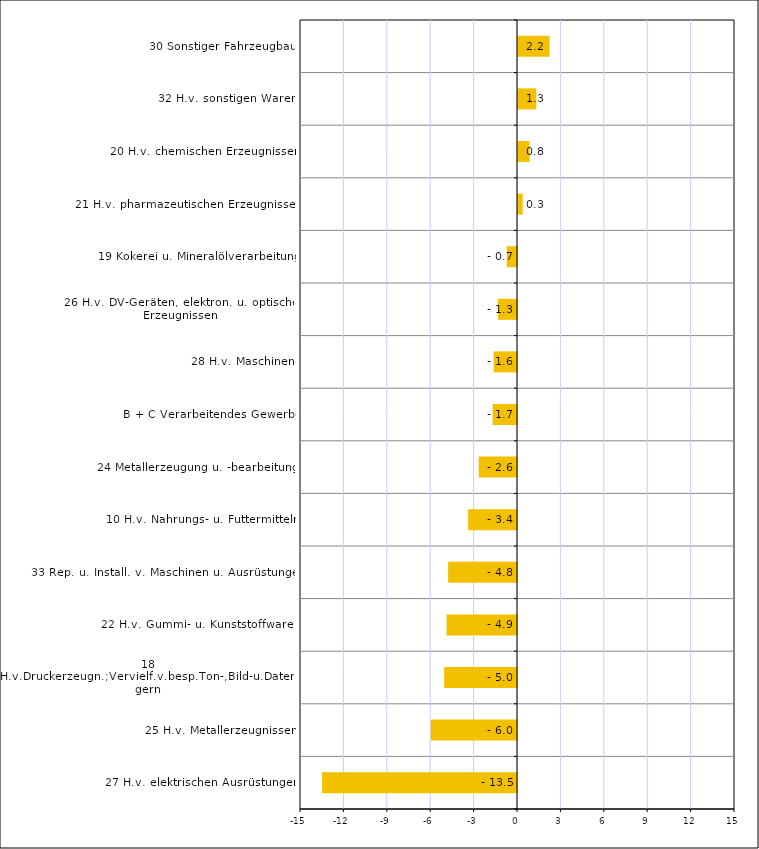
| Category | Series 0 |
|---|---|
| 27 H.v. elektrischen Ausrüstungen | -13.472 |
| 25 H.v. Metallerzeugnissen | -5.96 |
| 18 H.v.Druckerzeugn.;Vervielf.v.besp.Ton-,Bild-u.Datenträgern | -5.032 |
| 22 H.v. Gummi- u. Kunststoffwaren | -4.87 |
| 33 Rep. u. Install. v. Maschinen u. Ausrüstungen | -4.761 |
| 10 H.v. Nahrungs- u. Futtermitteln | -3.376 |
| 24 Metallerzeugung u. -bearbeitung | -2.647 |
| B + C Verarbeitendes Gewerbe | -1.686 |
| 28 H.v. Maschinen | -1.617 |
| 26 H.v. DV-Geräten, elektron. u. optischen Erzeugnissen | -1.315 |
| 19 Kokerei u. Mineralölverarbeitung | -0.708 |
| 21 H.v. pharmazeutischen Erzeugnissen | 0.323 |
| 20 H.v. chemischen Erzeugnissen | 0.793 |
| 32 H.v. sonstigen Waren | 1.265 |
| 30 Sonstiger Fahrzeugbau | 2.184 |